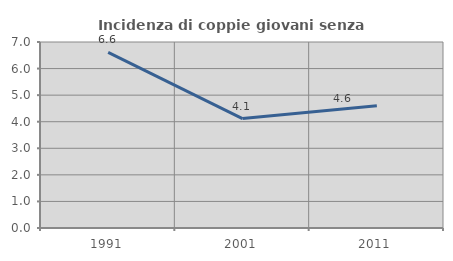
| Category | Incidenza di coppie giovani senza figli |
|---|---|
| 1991.0 | 6.608 |
| 2001.0 | 4.12 |
| 2011.0 | 4.598 |